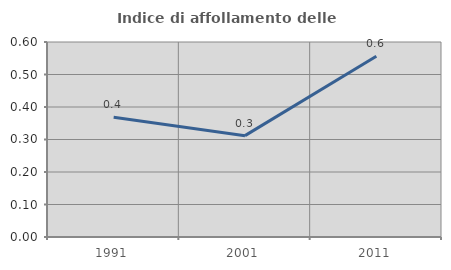
| Category | Indice di affollamento delle abitazioni  |
|---|---|
| 1991.0 | 0.369 |
| 2001.0 | 0.312 |
| 2011.0 | 0.556 |